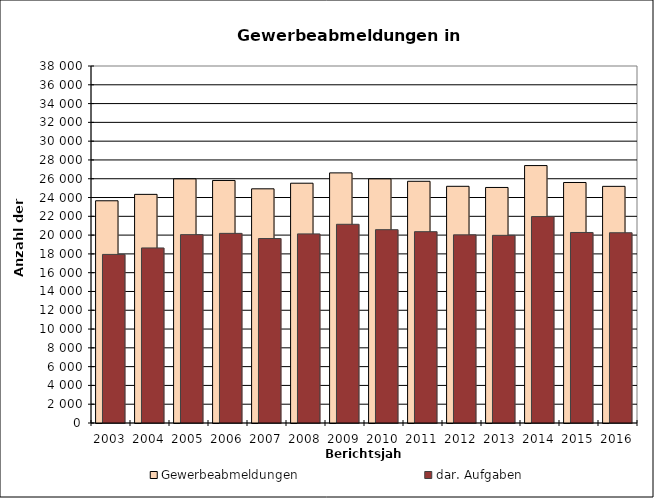
| Category | Gewerbeabmeldungen | dar. Aufgaben |
|---|---|---|
| 2003.0 | 23654 | 17944 |
| 2004.0 | 24336 | 18633 |
| 2005.0 | 25984 | 20051 |
| 2006.0 | 25816 | 20185 |
| 2007.0 | 24926 | 19635 |
| 2008.0 | 25523 | 20128 |
| 2009.0 | 26623 | 21151 |
| 2010.0 | 25984 | 20578 |
| 2011.0 | 25729 | 20364 |
| 2012.0 | 25195 | 20027 |
| 2013.0 | 25071 | 19975 |
| 2014.0 | 27402 | 21971 |
| 2015.0 | 25601 | 20280 |
| 2016.0 | 25189 | 20252 |